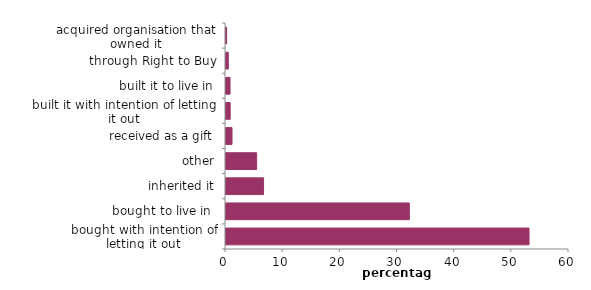
| Category | Series 0 |
|---|---|
| bought with intention of letting it out | 53.007 |
| bought to live in  | 32.066 |
| inherited it | 6.572 |
| other | 5.357 |
| received as a gift | 1.053 |
| built it with intention of letting it out | 0.727 |
| built it to live in | 0.706 |
| through Right to Buy | 0.402 |
| acquired organisation that owned it | 0.108 |